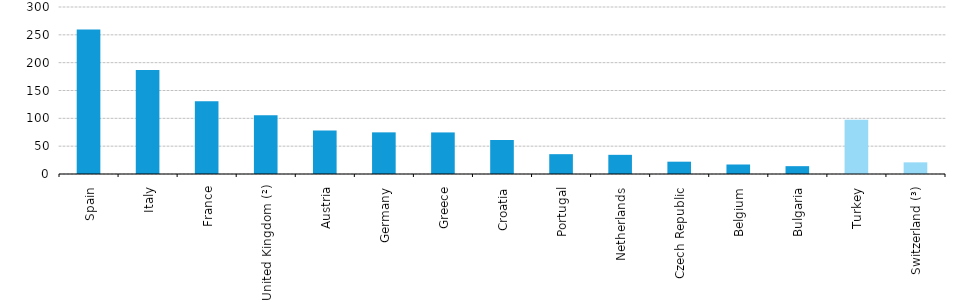
| Category | Series 0 |
|---|---|
| Spain | 259.636 |
| Italy | 186.872 |
| France | 130.909 |
| United Kingdom (²) | 105.456 |
| Austria | 78.099 |
| Germany | 74.805 |
| Greece | 74.675 |
| Croatia | 61.073 |
| Portugal | 35.63 |
| Netherlands | 34.424 |
| Czech Republic | 22.11 |
| Belgium | 17.069 |
| Bulgaria | 14.078 |
| Turkey | 97.581 |
| Switzerland (³) | 20.925 |